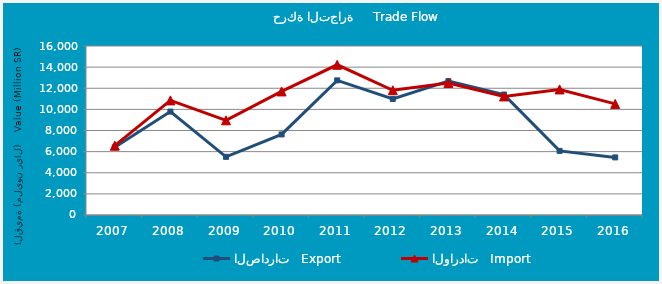
| Category | الصادرات   Export | الواردات   Import |
|---|---|---|
| 2007.0 | 6404.956 | 6563.709 |
| 2008.0 | 9789.695 | 10850.814 |
| 2009.0 | 5508.544 | 8963.812 |
| 2010.0 | 7626.589 | 11699.085 |
| 2011.0 | 12746.048 | 14222.156 |
| 2012.0 | 10987.481 | 11810.327 |
| 2013.0 | 12670.243 | 12499.8 |
| 2014.0 | 11399.583 | 11225.087 |
| 2015.0 | 6068.886 | 11888.55 |
| 2016.0 | 5451.971 | 10518.071 |